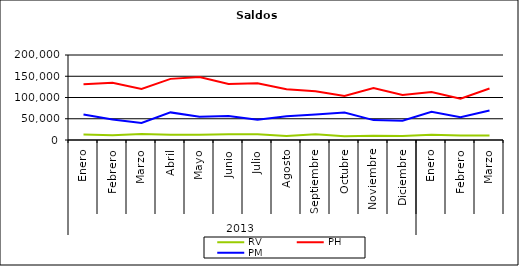
| Category | RV | PH | PM |
|---|---|---|---|
| 0 | 12966.437 | 131380.856 | 59975.653 |
| 1 | 11432.271 | 134655.891 | 48046.612 |
| 2 | 14149.543 | 120343.782 | 40297.909 |
| 3 | 12403.249 | 143830.507 | 64946.114 |
| 4 | 12323.134 | 148139.781 | 54592.514 |
| 5 | 13759.976 | 131634.752 | 56652.701 |
| 6 | 13256.014 | 133515.147 | 47907.561 |
| 7 | 9335.8 | 119600.732 | 55860.576 |
| 8 | 13362.811 | 114843.232 | 59771.51 |
| 9 | 9080.978 | 103607.627 | 64696.186 |
| 10 | 9993.913 | 122533.872 | 46801.148 |
| 11 | 9303.464 | 105747.395 | 45455.331 |
| 12 | 12145.055 | 112918.262 | 66200.17 |
| 13 | 10742.048 | 97242.789 | 53817.215 |
| 14 | 10795.854 | 121097.504 | 69409.543 |